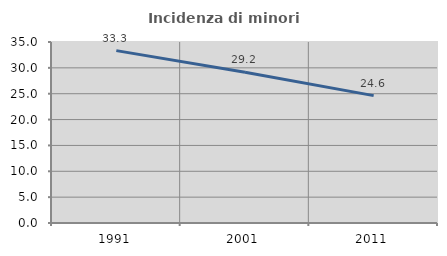
| Category | Incidenza di minori stranieri |
|---|---|
| 1991.0 | 33.333 |
| 2001.0 | 29.167 |
| 2011.0 | 24.627 |